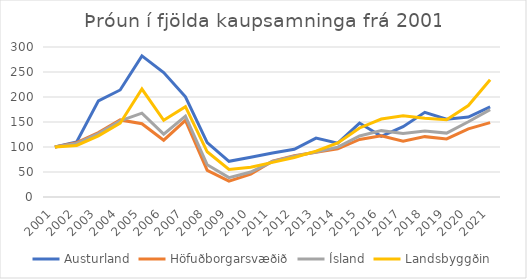
| Category | Austurland | Höfuðborgarsvæðið | Ísland | Landsbyggðin |
|---|---|---|---|---|
| 2001.0 | 100 | 100 | 100 | 100 |
| 2002.0 | 109.896 | 108.807 | 107.085 | 103.141 |
| 2003.0 | 192.188 | 128.737 | 126.75 | 122.199 |
| 2004.0 | 214.062 | 154.183 | 152.164 | 147.539 |
| 2005.0 | 282.292 | 146.579 | 167.65 | 215.916 |
| 2006.0 | 248.958 | 113.591 | 125.668 | 153.333 |
| 2007.0 | 200.521 | 153.284 | 161.572 | 180.558 |
| 2008.0 | 108.854 | 53.131 | 64.468 | 90.436 |
| 2009.0 | 71.354 | 31.617 | 38.768 | 55.148 |
| 2010.0 | 79.688 | 45.757 | 49.894 | 59.372 |
| 2011.0 | 88.021 | 71.72 | 70.948 | 69.18 |
| 2012.0 | 95.312 | 82.554 | 81.502 | 79.092 |
| 2013.0 | 117.708 | 89.349 | 90.104 | 91.832 |
| 2014.0 | 107.812 | 96.176 | 99.82 | 108.168 |
| 2015.0 | 147.917 | 115.008 | 122.02 | 138.08 |
| 2016.0 | 121.354 | 122.612 | 132.722 | 155.881 |
| 2017.0 | 140.625 | 111.732 | 127.111 | 162.339 |
| 2018.0 | 169.271 | 120.722 | 131.841 | 157.312 |
| 2019.0 | 155.729 | 116.09 | 127.811 | 154.66 |
| 2020.0 | 159.896 | 136.371 | 150.541 | 183.002 |
| 2021.0 | 180.208 | 148.819 | 174.83 | 234.415 |